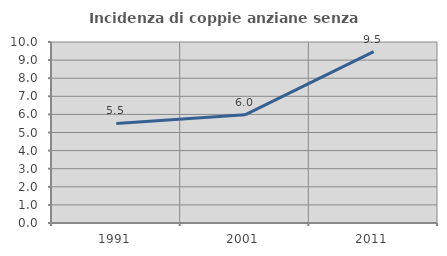
| Category | Incidenza di coppie anziane senza figli  |
|---|---|
| 1991.0 | 5.498 |
| 2001.0 | 5.974 |
| 2011.0 | 9.467 |